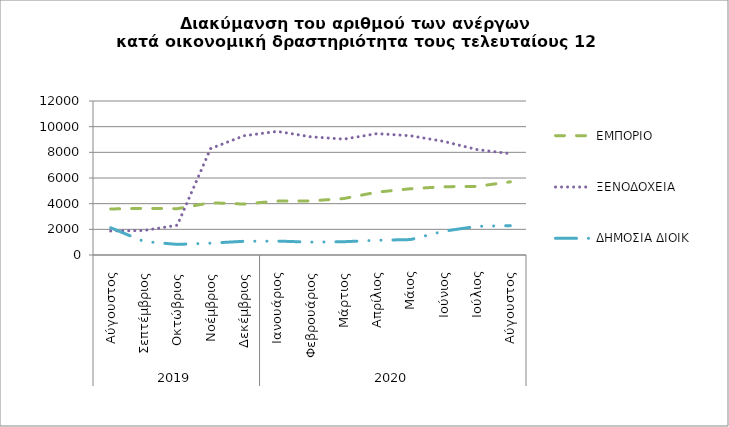
| Category | ΕΜΠΟΡΙΟ | ΞΕΝΟΔΟΧΕΙΑ | ΔΗΜΟΣΙΑ ΔΙΟΙΚ |
|---|---|---|---|
| 0 | 3586 | 1872 | 2125 |
| 1 | 3637 | 1911 | 1050 |
| 2 | 3610 | 2319 | 826 |
| 3 | 4072 | 8292 | 922 |
| 4 | 3969 | 9290 | 1069 |
| 5 | 4202 | 9632 | 1085 |
| 6 | 4212 | 9214 | 1003 |
| 7 | 4400 | 9028 | 1034 |
| 8 | 4898 | 9457 | 1149 |
| 9 | 5162 | 9293 | 1202 |
| 10 | 5321 | 8852 | 1854 |
| 11 | 5347 | 8216 | 2234 |
| 12 | 5703 | 7894 | 2289 |